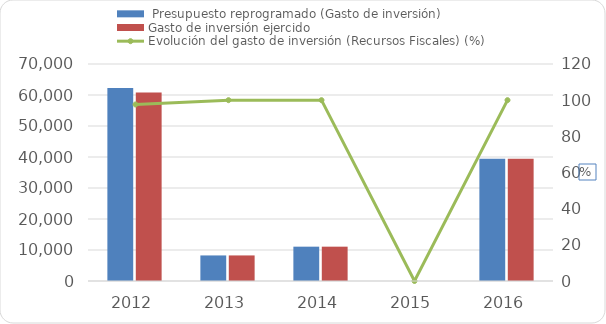
| Category |  Presupuesto reprogramado (Gasto de inversión) | Gasto de inversión ejercido |
|---|---|---|
| 2012 | 62284.9 | 60803 |
| 2013 | 8247.4 | 8247.4 |
| 2014 | 11074.7 | 11074.7 |
| 2015 | 0 | 0 |
| 2016 | 39440.1 | 39440.1 |